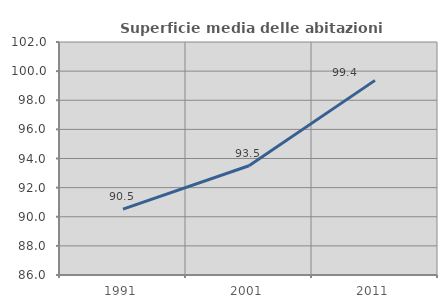
| Category | Superficie media delle abitazioni occupate |
|---|---|
| 1991.0 | 90.519 |
| 2001.0 | 93.501 |
| 2011.0 | 99.365 |